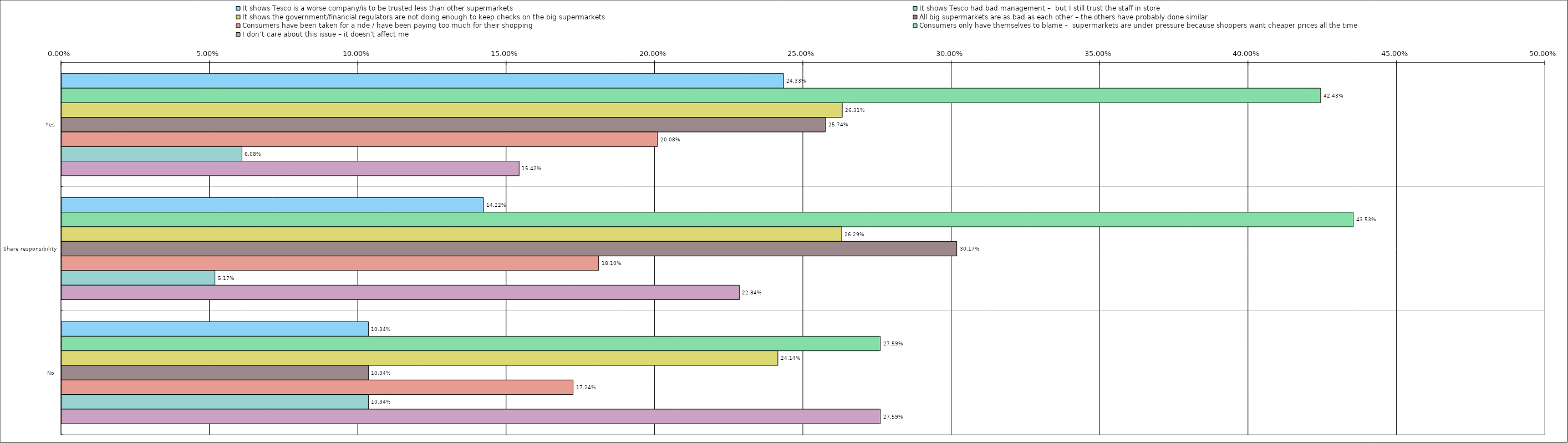
| Category | It shows Tesco is a worse company/is to be trusted less than other supermarkets | It shows Tesco had bad management –  but I still trust the staff in store | It shows the government/financial regulators are not doing enough to keep checks on the big supermarkets | All big supermarkets are as bad as each other – the others have probably done similar | Consumers have been taken for a ride / have been paying too much for their shopping | Consumers only have themselves to blame –  supermarkets are under pressure because shoppers want cheaper prices all the time | I don’t care about this issue – it doesn't affect me |
|---|---|---|---|---|---|---|---|
| 0 | 0.243 | 0.424 | 0.263 | 0.257 | 0.201 | 0.061 | 0.154 |
| 1 | 0.142 | 0.435 | 0.263 | 0.302 | 0.181 | 0.052 | 0.228 |
| 2 | 0.103 | 0.276 | 0.241 | 0.103 | 0.172 | 0.103 | 0.276 |